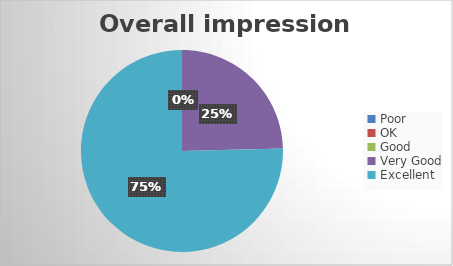
| Category | Overall impression (%) |
|---|---|
| Poor | 0 |
| OK | 0 |
| Good | 0 |
| Very Good | 24.62 |
| Excellent | 75.39 |